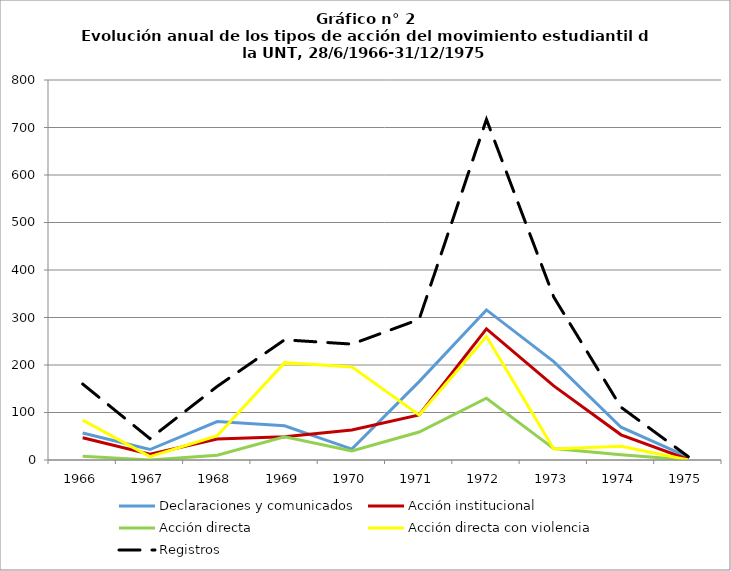
| Category | Declaraciones y comunicados | Acción institucional | Acción directa | Acción directa con violencia | Registros |
|---|---|---|---|---|---|
| 1966.0 | 57 | 47 | 8 | 84 | 160 |
| 1967.0 | 22 | 12 | 0 | 7 | 45 |
| 1968.0 | 81 | 44 | 10 | 51 | 155 |
| 1969.0 | 72 | 49 | 49 | 205 | 253 |
| 1970.0 | 23 | 63 | 19 | 196 | 244 |
| 1971.0 | 165 | 95 | 59 | 95 | 296 |
| 1972.0 | 316 | 276 | 130 | 260 | 717 |
| 1973.0 | 207 | 156 | 24 | 23 | 343 |
| 1974.0 | 69 | 53 | 11 | 29 | 111 |
| 1975.0 | 6 | 1 | 0 | 0 | 7 |